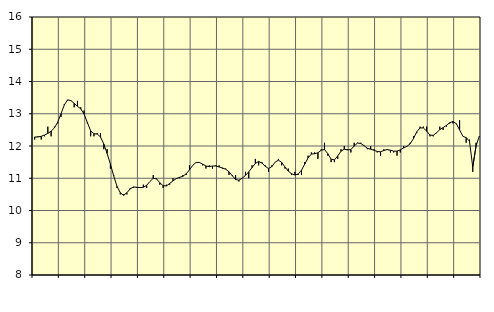
| Category | Piggar | Handel, SNI 45-47 |
|---|---|---|
| nan | 12.2 | 12.28 |
| 87.0 | 12.3 | 12.28 |
| 87.0 | 12.2 | 12.3 |
| 87.0 | 12.3 | 12.34 |
| nan | 12.6 | 12.39 |
| 88.0 | 12.3 | 12.46 |
| 88.0 | 12.6 | 12.56 |
| 88.0 | 12.7 | 12.74 |
| nan | 12.9 | 13 |
| 89.0 | 13.3 | 13.27 |
| 89.0 | 13.4 | 13.43 |
| 89.0 | 13.4 | 13.41 |
| nan | 13.2 | 13.32 |
| 90.0 | 13.4 | 13.23 |
| 90.0 | 13.2 | 13.15 |
| 90.0 | 13.1 | 12.99 |
| nan | 12.7 | 12.73 |
| 91.0 | 12.3 | 12.47 |
| 91.0 | 12.3 | 12.38 |
| 91.0 | 12.4 | 12.37 |
| nan | 12.4 | 12.28 |
| 92.0 | 11.9 | 12.06 |
| 92.0 | 11.9 | 11.77 |
| 92.0 | 11.3 | 11.44 |
| nan | 11.1 | 11.07 |
| 93.0 | 10.7 | 10.75 |
| 93.0 | 10.5 | 10.55 |
| 93.0 | 10.5 | 10.47 |
| nan | 10.5 | 10.55 |
| 94.0 | 10.7 | 10.67 |
| 94.0 | 10.7 | 10.73 |
| 94.0 | 10.7 | 10.72 |
| nan | 10.7 | 10.71 |
| 95.0 | 10.8 | 10.72 |
| 95.0 | 10.7 | 10.78 |
| 95.0 | 10.9 | 10.9 |
| nan | 11.1 | 11 |
| 96.0 | 11 | 10.98 |
| 96.0 | 10.8 | 10.86 |
| 96.0 | 10.7 | 10.77 |
| nan | 10.8 | 10.76 |
| 97.0 | 10.8 | 10.84 |
| 97.0 | 11 | 10.92 |
| 97.0 | 11 | 10.99 |
| nan | 11 | 11.03 |
| 98.0 | 11.1 | 11.06 |
| 98.0 | 11.1 | 11.14 |
| 98.0 | 11.4 | 11.26 |
| nan | 11.4 | 11.4 |
| 99.0 | 11.5 | 11.49 |
| 99.0 | 11.5 | 11.49 |
| 99.0 | 11.4 | 11.44 |
| nan | 11.3 | 11.38 |
| 0.0 | 11.4 | 11.36 |
| 0.0 | 11.3 | 11.38 |
| 0.0 | 11.4 | 11.38 |
| nan | 11.4 | 11.35 |
| 1.0 | 11.3 | 11.32 |
| 1.0 | 11.3 | 11.28 |
| 1.0 | 11.1 | 11.2 |
| nan | 11.1 | 11.08 |
| 2.0 | 11.1 | 10.96 |
| 2.0 | 10.9 | 10.94 |
| 2.0 | 11 | 11 |
| nan | 11.2 | 11.09 |
| 3.0 | 11 | 11.2 |
| 3.0 | 11.4 | 11.33 |
| 3.0 | 11.6 | 11.46 |
| nan | 11.4 | 11.52 |
| 4.0 | 11.5 | 11.47 |
| 4.0 | 11.4 | 11.37 |
| 4.0 | 11.2 | 11.3 |
| nan | 11.4 | 11.36 |
| 5.0 | 11.5 | 11.5 |
| 5.0 | 11.6 | 11.56 |
| 5.0 | 11.4 | 11.49 |
| nan | 11.3 | 11.35 |
| 6.0 | 11.3 | 11.22 |
| 6.0 | 11.1 | 11.14 |
| 6.0 | 11.2 | 11.1 |
| nan | 11.1 | 11.13 |
| 7.0 | 11.1 | 11.25 |
| 7.0 | 11.5 | 11.44 |
| 7.0 | 11.7 | 11.63 |
| nan | 11.8 | 11.75 |
| 8.0 | 11.8 | 11.76 |
| 8.0 | 11.6 | 11.79 |
| 8.0 | 11.9 | 11.87 |
| nan | 12.1 | 11.89 |
| 9.0 | 11.7 | 11.76 |
| 9.0 | 11.5 | 11.59 |
| 9.0 | 11.5 | 11.57 |
| nan | 11.6 | 11.69 |
| 10.0 | 11.9 | 11.84 |
| 10.0 | 12 | 11.9 |
| 10.0 | 11.9 | 11.88 |
| nan | 11.8 | 11.89 |
| 11.0 | 12.1 | 12 |
| 11.0 | 12.1 | 12.09 |
| 11.0 | 12.1 | 12.08 |
| nan | 12 | 12.01 |
| 12.0 | 11.9 | 11.93 |
| 12.0 | 12 | 11.9 |
| 12.0 | 11.9 | 11.87 |
| nan | 11.8 | 11.83 |
| 13.0 | 11.7 | 11.82 |
| 13.0 | 11.9 | 11.86 |
| 13.0 | 11.9 | 11.89 |
| nan | 11.8 | 11.87 |
| 14.0 | 11.8 | 11.84 |
| 14.0 | 11.7 | 11.84 |
| 14.0 | 11.8 | 11.88 |
| nan | 12 | 11.94 |
| 15.0 | 12 | 11.99 |
| 15.0 | 12.1 | 12.07 |
| 15.0 | 12.3 | 12.23 |
| nan | 12.4 | 12.44 |
| 16.0 | 12.6 | 12.56 |
| 16.0 | 12.6 | 12.56 |
| 16.0 | 12.6 | 12.46 |
| nan | 12.3 | 12.34 |
| 17.0 | 12.3 | 12.33 |
| 17.0 | 12.4 | 12.41 |
| 17.0 | 12.6 | 12.51 |
| nan | 12.5 | 12.57 |
| 18.0 | 12.6 | 12.64 |
| 18.0 | 12.7 | 12.72 |
| 18.0 | 12.7 | 12.76 |
| nan | 12.7 | 12.69 |
| 19.0 | 12.8 | 12.5 |
| 19.0 | 12.3 | 12.3 |
| 19.0 | 12.1 | 12.26 |
| nan | 12.2 | 12.15 |
| 20.0 | 11.2 | 11.35 |
| 20.0 | 12.1 | 12 |
| 20.0 | 12.3 | 12.31 |